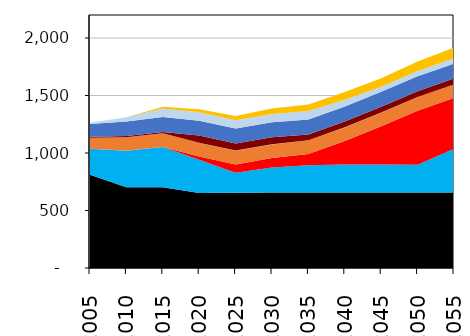
| Category | Series 2 | Series 3 | Series 4 | Series 1 | Series 0 | Series 5 | Series 6 | Series 7 | Series 8 | Series 9 | Series 10 | Series 11 | Series 12 | Series 13 |
|---|---|---|---|---|---|---|---|---|---|---|---|---|---|---|
| 2005.0 | 0 | 811.16 | 0 | 226.05 | 0 | 0.51 | 93.83 | 0 | 0 | 1.21 | 7.9 | 110.96 | 10.45 | 1.24 |
| 2010.0 | 0 | 701.48 | 0 | 319.1 | 0 | 0.75 | 114.57 | 0 | 0 | 1.21 | 10.72 | 125.19 | 38.5 | 0.31 |
| 2015.0 | 0 | 701.5 | 0 | 350.7 | 0 | 0.52 | 118.68 | 0 | 0 | 1.21 | 10.72 | 129.93 | 72.7 | 16.65 |
| 2020.0 | 0 | 653.17 | 0 | 287.26 | 29.86 | 0.03 | 118.68 | 0 | 0 | 1.21 | 61.19 | 129.93 | 72.7 | 26.91 |
| 2025.0 | 0 | 654.96 | 0 | 173.05 | 72.93 | 0.02 | 118.68 | 0 | 0 | 1.21 | 61.19 | 129.93 | 72.7 | 37.16 |
| 2030.0 | 0 | 655.82 | 0 | 217.63 | 82.54 | 0.02 | 118.68 | 0 | 0 | 1.21 | 61.19 | 129.93 | 72.7 | 47.42 |
| 2035.0 | 0 | 655.82 | 0 | 238.71 | 96.75 | 0.02 | 118.68 | 0 | 0 | 1.21 | 50.47 | 129.93 | 72.7 | 57.45 |
| 2040.0 | 0 | 655.82 | 0 | 244.54 | 203.12 | 0.02 | 118.68 | 0 | 0 | 1.21 | 50.47 | 129.93 | 58.57 | 67.71 |
| 2045.0 | 0 | 655.82 | 0 | 244.64 | 331.23 | 0.02 | 118.68 | 0 | 0 | 1.21 | 50.47 | 129.93 | 44.85 | 73.78 |
| 2050.0 | 0 | 655.82 | 0 | 242.14 | 470.4 | 0.02 | 118.68 | 0 | 0 | 0 | 50.47 | 129.93 | 44.85 | 84.04 |
| 2055.0 | 0 | 655.82 | 0 | 380.32 | 442.76 | 0.02 | 118.68 | 0 | 0 | 0 | 50.47 | 129.93 | 44.85 | 94.29 |